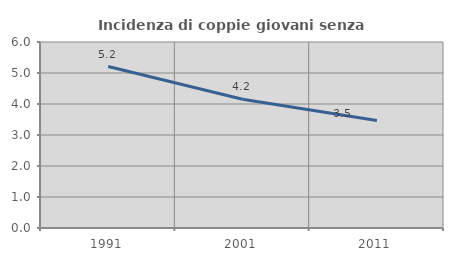
| Category | Incidenza di coppie giovani senza figli |
|---|---|
| 1991.0 | 5.208 |
| 2001.0 | 4.153 |
| 2011.0 | 3.47 |